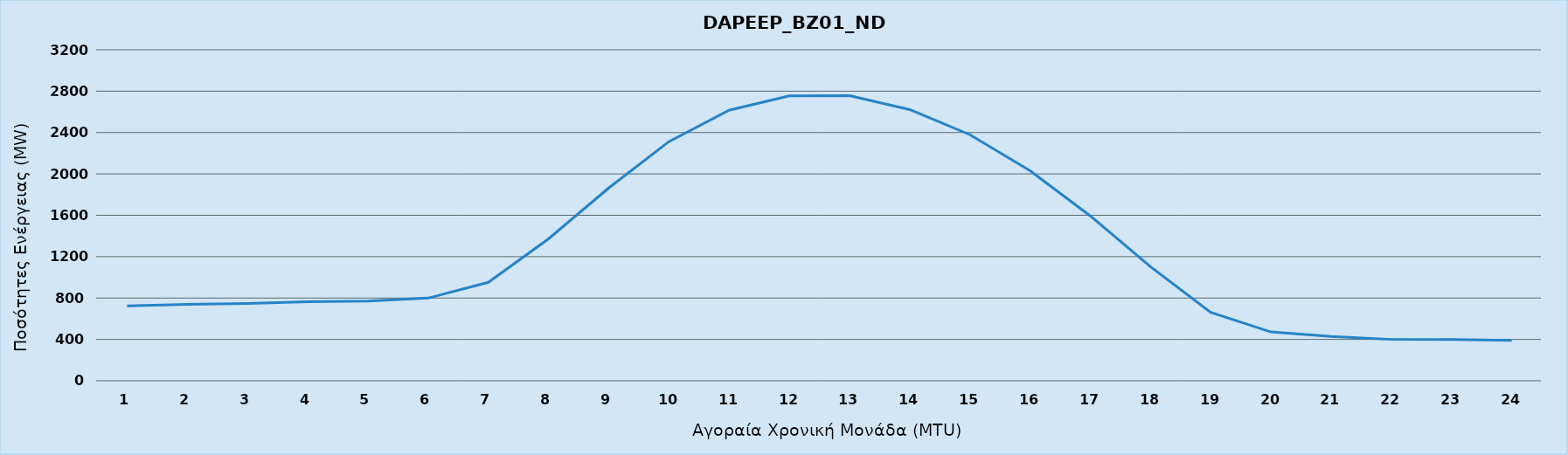
| Category | DAPEEP_BZ01_NDR |
|---|---|
| 0 | 724 |
| 1 | 738 |
| 2 | 747 |
| 3 | 764 |
| 4 | 770 |
| 5 | 799 |
| 6 | 952 |
| 7 | 1372 |
| 8 | 1864 |
| 9 | 2312 |
| 10 | 2615 |
| 11 | 2754 |
| 12 | 2756 |
| 13 | 2622 |
| 14 | 2379 |
| 15 | 2030 |
| 16 | 1594 |
| 17 | 1103 |
| 18 | 661 |
| 19 | 472 |
| 20 | 428 |
| 21 | 400 |
| 22 | 398 |
| 23 | 391 |